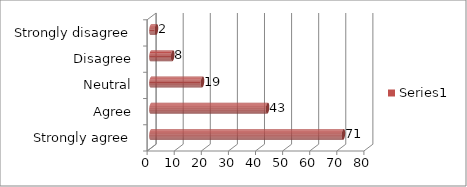
| Category | Series 0 |
|---|---|
| Strongly agree | 71 |
| Agree | 43 |
| Neutral | 19 |
| Disagree | 8 |
| Strongly disagree | 2 |